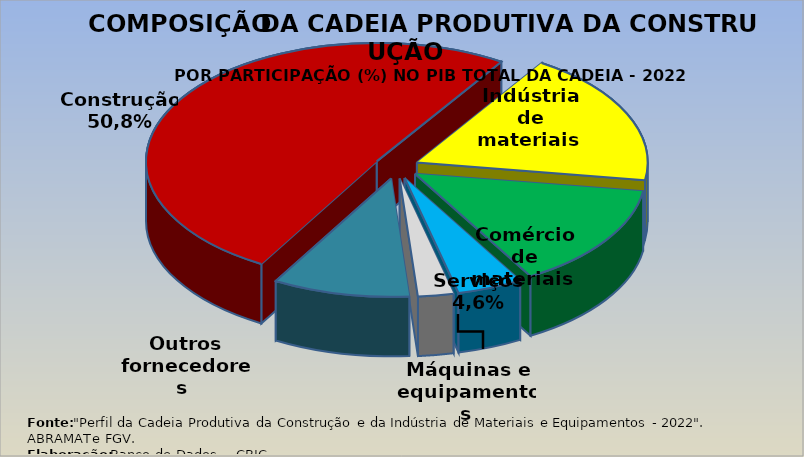
| Category | Participação |
|---|---|
| Construção | 0.508 |
| Indústria de materiais | 0.183 |
| Comércio de materiais | 0.143 |
| Serviços | 0.046 |
| Máquinas e equipamentos | 0.025 |
| Outros fornecedores | 0.096 |